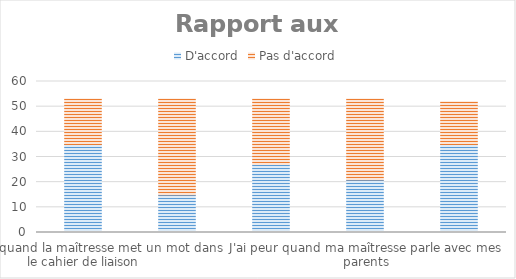
| Category | D'accord | Pas d'accord |
|---|---|---|
| J'ai peur quand la maîtresse met un mot dans le cahier de liaison | 35 | 18 |
| J'ai peur de montrer mon travail à mes parents | 15 | 38 |
| J'ai peur de me tromper quand je fais des exercices | 27 | 26 |
| J'ai peur quand ma maîtresse parle avec mes parents | 21 | 32 |
| J'ai peur d'avoir de mauvaises notes | 35 | 17 |